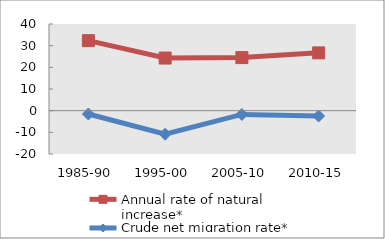
| Category | Annual rate of natural increase* | Crude net migration rate* |
|---|---|---|
| 1985-90 | 32.306 | -1.543 |
| 1995-00 | 24.28 | -10.853 |
| 2005-10 | 24.5 | -1.728 |
| 2010-15 | 26.68 | -2.463 |